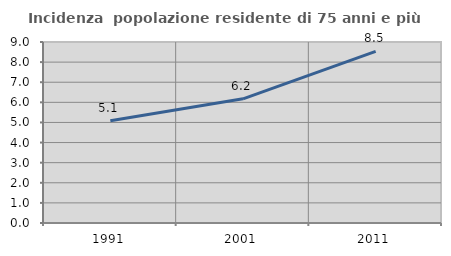
| Category | Incidenza  popolazione residente di 75 anni e più |
|---|---|
| 1991.0 | 5.089 |
| 2001.0 | 6.173 |
| 2011.0 | 8.537 |